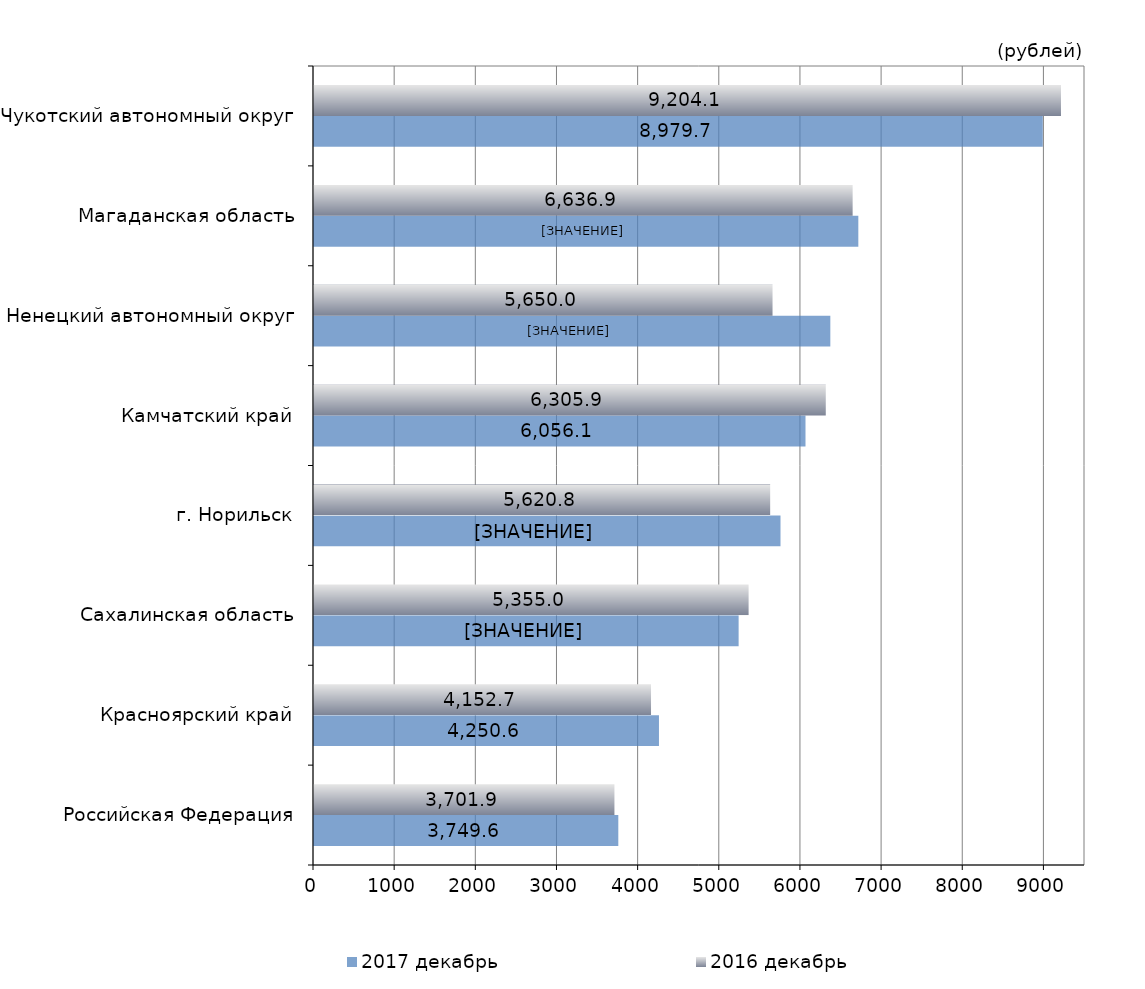
| Category | 2017 декабрь | 2016 декабрь |
|---|---|---|
| Российская Федерация | 3749.6 | 3701.89 |
| Красноярский край | 4250.62 | 4152.71 |
| Сахалинская область | 5232.2 | 5355.04 |
| г. Норильск | 5748.02 | 5620.83 |
| Камчатский край | 6056.07 | 6305.93 |
| Ненецкий автономный округ | 6362.01 | 5649.95 |
| Магаданская область | 6707 | 6636.93 |
| Чукотский автономный округ | 8979.68 | 9204.08 |